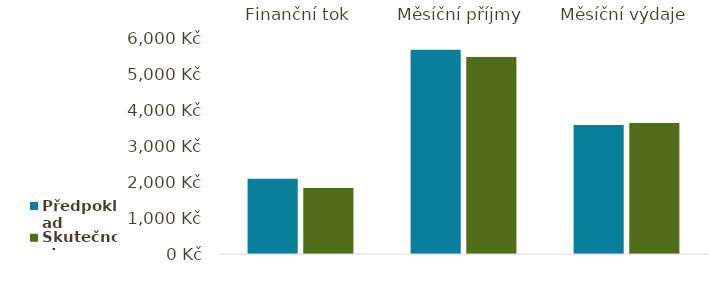
| Category | Předpoklad | Skutečnost |
|---|---|---|
| Finanční tok | 2097 | 1845 |
| Měsíční příjmy | 5700 | 5500 |
| Měsíční výdaje | 3603 | 3655 |